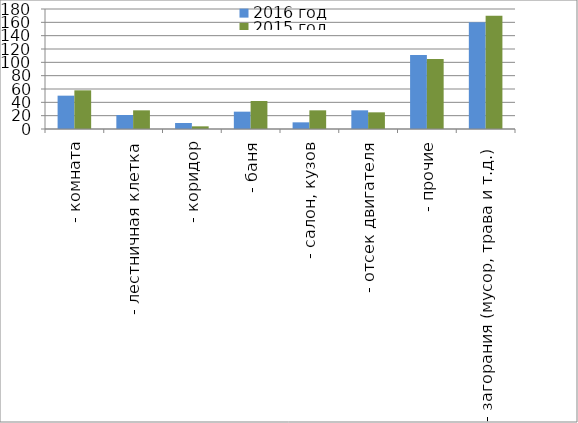
| Category | 2016 год | 2015 год |
|---|---|---|
|  - комната | 50 | 58 |
|  - лестничная клетка | 21 | 28 |
|  - коридор | 9 | 4 |
|  - баня | 26 | 42 |
|  - салон, кузов | 10 | 28 |
|  - отсек двигателя | 28 | 25 |
| - прочие | 111 | 105 |
| - загорания (мусор, трава и т.д.)  | 160 | 170 |